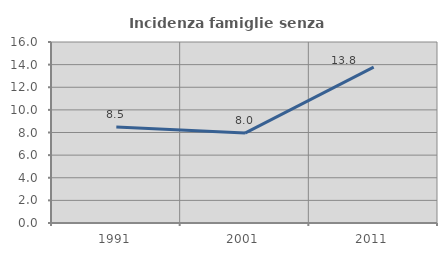
| Category | Incidenza famiglie senza nuclei |
|---|---|
| 1991.0 | 8.484 |
| 2001.0 | 7.951 |
| 2011.0 | 13.779 |